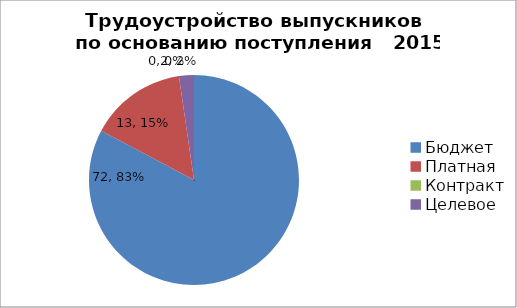
| Category | 2015 г. |
|---|---|
| Бюджет | 72 |
| Платная | 13 |
| Контракт | 0 |
| Целевое | 2 |